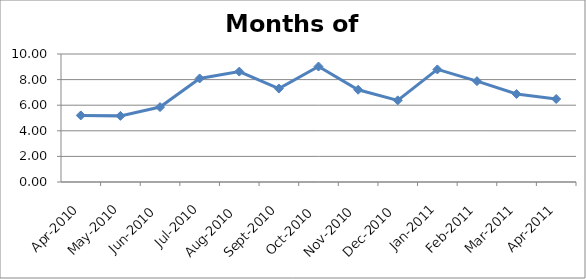
| Category | Series 0 |
|---|---|
| 2010-04-01 | 5.201 |
| 2010-05-01 | 5.166 |
| 2010-06-01 | 5.853 |
| 2010-07-01 | 8.09 |
| 2010-08-01 | 8.625 |
| 2010-09-01 | 7.3 |
| 2010-10-01 | 9.022 |
| 2010-11-01 | 7.207 |
| 2010-12-01 | 6.379 |
| 2011-01-01 | 8.795 |
| 2011-02-01 | 7.878 |
| 2011-03-01 | 6.872 |
| 2011-04-01 | 6.484 |